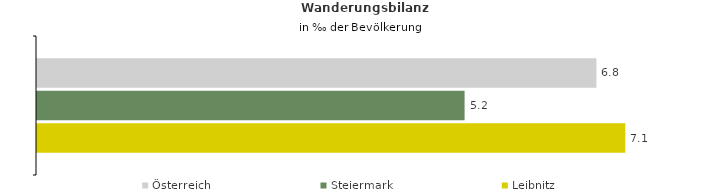
| Category | Österreich | Steiermark | Leibnitz |
|---|---|---|---|
| Wanderungsrate in ‰ der Bevölkerung, Periode 2015-2019 | 6.771 | 5.175 | 7.12 |